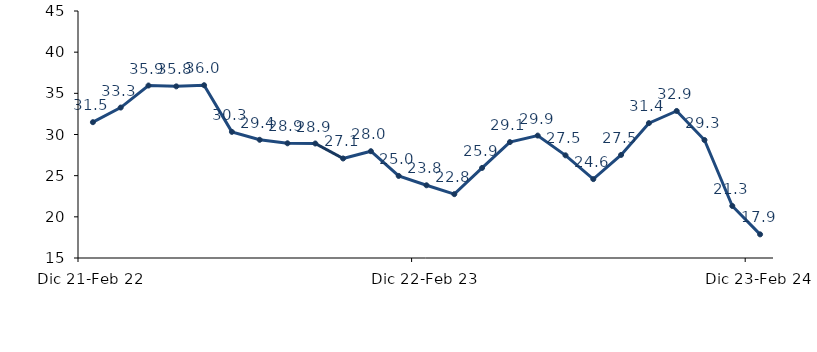
| Category | Semanas |
|---|---|
| Dic 21-Feb 22 | 31.496 |
| Ene-Mar 2022 | 33.273 |
| Feb-Abr 2022 | 35.949 |
| Mar-May 2022 | 35.845 |
| Abr-Jun 2022 | 35.985 |
| May-Jul 2022 | 30.321 |
| Jun-Ago 2022 | 29.357 |
| Jul-Sep 2022 | 28.931 |
| Ago-Oct 2022 | 28.907 |
| Sep-Nov 2022 | 27.087 |
| Oct-Dic 2022 | 27.97 |
| Nov 22-Ene 23 | 24.968 |
| Dic 22-Feb 23 | 23.831 |
| Ene-Mar 2023 | 22.753 |
| Feb-Abr 2023 | 25.944 |
| Mar-May 2023 | 29.074 |
| Abr-Jun 2023 | 29.87 |
| May-Jul 2023 | 27.47 |
| Jun-Ago 2023 | 24.58 |
| Jul-Sep 2023 | 27.52 |
| Ago-Oct 2023 | 31.38 |
| Sep-Nov 2023 | 32.86 |
| Oct-Dic 2023 | 29.33 |
| Nov 23-Ene 24 | 21.32 |
| Dic 23-Feb 24 | 17.87 |